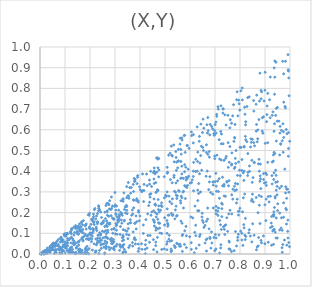
| Category | Series 0 |
|---|---|
| 0.20426082624092745 | 0.143 |
| 0.36272719815670096 | 0.294 |
| 0.8153955051735944 | 0.355 |
| 0.3729846032833899 | 0.336 |
| 0.8045086489264134 | 0.515 |
| 0.1439994279631579 | 0.007 |
| 0.8717027761930042 | 0.6 |
| 0.9951669443724769 | 0.851 |
| 0.8722146589589249 | 0.2 |
| 0.8231444333154888 | 0.639 |
| 0.8858583309482669 | 0.054 |
| 0.6836288513205269 | 0.028 |
| 0.6956370302324736 | 0.582 |
| 0.9128229049434629 | 0.277 |
| 0.7866731166661785 | 0.745 |
| 0.9286679426933921 | 0.67 |
| 0.03636047862152203 | 0.013 |
| 0.9949222020885375 | 0.055 |
| 0.10073876753924604 | 0.004 |
| 0.6173904949461092 | 0.006 |
| 0.9361999415781771 | 0.593 |
| 0.4546234243039249 | 0.209 |
| 0.7942854840604906 | 0.445 |
| 0.453441863623966 | 0.07 |
| 0.7034644494690323 | 0.39 |
| 0.08862146865692822 | 0.014 |
| 0.8657607751653718 | 0.02 |
| 0.1778056656379653 | 0.087 |
| 0.9908134551769016 | 0.11 |
| 0.5734910125883016 | 0.365 |
| 0.025885028320127956 | 0.019 |
| 0.18910464906426017 | 0.087 |
| 0.058720695203867024 | 0.018 |
| 0.9988391513887683 | 0.545 |
| 0.7531435049663163 | 0.418 |
| 0.5453642049344821 | 0.404 |
| 0.28661217034137265 | 0.119 |
| 0.6293666507666607 | 0.4 |
| 0.10953422019362935 | 0.038 |
| 0.736399254082159 | 0.336 |
| 0.6689070766604224 | 0.401 |
| 0.877908004540325 | 0.739 |
| 0.13989807700627843 | 0.005 |
| 0.8034697403553471 | 0.788 |
| 0.3613317264856879 | 0.166 |
| 0.2716113823469338 | 0.075 |
| 0.7772426047332179 | 0.413 |
| 0.230289860706544 | 0.058 |
| 0.9858885750368827 | 0.145 |
| 0.6006705914541699 | 0.343 |
| 0.8167280837820041 | 0.4 |
| 0.8890980154758239 | 0.594 |
| 0.8224665428520189 | 0.624 |
| 0.7261052932751103 | 0.58 |
| 0.9211750492984048 | 0.855 |
| 0.864371083432124 | 0.723 |
| 0.5536000208553401 | 0.506 |
| 0.766303091895723 | 0.43 |
| 0.2071403551075638 | 0.073 |
| 0.5785187022987416 | 0.33 |
| 0.5291774522851926 | 0.473 |
| 0.2635962169169568 | 0.113 |
| 0.9821509240772714 | 0.931 |
| 0.8086825867615756 | 0.802 |
| 0.8102758712557877 | 0.204 |
| 0.7366243455381281 | 0.28 |
| 0.2531722291397108 | 0.15 |
| 0.26981595716468465 | 0.149 |
| 0.5078422854178415 | 0.162 |
| 0.11728472437353166 | 0.02 |
| 0.2694240173599839 | 0.187 |
| 0.5298944465102073 | 0.186 |
| 0.2382102585453839 | 0.017 |
| 0.62244907969625 | 0.398 |
| 0.8028624765664213 | 0.11 |
| 0.9379420180453679 | 0.225 |
| 0.0810122083528747 | 0.057 |
| 0.9404600337599457 | 0.277 |
| 0.9440288562619685 | 0.077 |
| 0.18918474456399714 | 0.018 |
| 0.18152301695239692 | 0.024 |
| 0.5511701843380219 | 0.049 |
| 0.16602953981180335 | 0.072 |
| 0.7138296633233044 | 0.222 |
| 0.38416116291410807 | 0.184 |
| 0.5119570314778064 | 0.141 |
| 0.3589990521461809 | 0.321 |
| 0.02248040734097445 | 0.012 |
| 0.782787944527805 | 0.438 |
| 0.17037306247257478 | 0.141 |
| 0.32302890541042795 | 0.032 |
| 0.6132757652107951 | 0.537 |
| 0.7671430962477555 | 0.194 |
| 0.9367349539748241 | 0.899 |
| 0.328903918637116 | 0.187 |
| 0.9390570919229485 | 0.485 |
| 0.21121281889740506 | 0.104 |
| 0.6972482574754387 | 0.573 |
| 0.6987492200506394 | 0.596 |
| 0.5778197350301918 | 0.046 |
| 0.08457363760785963 | 0.071 |
| 0.0020432830335050944 | 0.002 |
| 0.739401217180128 | 0.137 |
| 0.4543857058536014 | 0.021 |
| 0.29387802545341835 | 0.059 |
| 0.16861424153614768 | 0.113 |
| 0.9874000073999551 | 0.043 |
| 0.5203910463553771 | 0.487 |
| 0.9450880229823172 | 0.704 |
| 0.09135840629216607 | 0.069 |
| 0.16371353473478523 | 0.003 |
| 0.44625596999551886 | 0.326 |
| 0.8379488037062102 | 0.399 |
| 0.36660160080648796 | 0.187 |
| 0.05054124931553772 | 0.049 |
| 0.07004184901843591 | 0.04 |
| 0.3984714322417813 | 0.325 |
| 0.05286585466638882 | 0.035 |
| 0.24626442548236527 | 0.067 |
| 0.03230455443888447 | 0.014 |
| 0.5070130685234417 | 0.047 |
| 0.7931853362486412 | 0.206 |
| 0.42846662173983563 | 0.33 |
| 0.4863749598631587 | 0.247 |
| 0.6345063372000457 | 0.292 |
| 0.6495537378866599 | 0.162 |
| 0.8796642263016647 | 0.351 |
| 0.7391998202623412 | 0.094 |
| 0.2973303675122261 | 0.035 |
| 0.10321127724795764 | 0.052 |
| 0.029147267083311723 | 0.028 |
| 0.08491017508891441 | 0.029 |
| 0.4718970721325203 | 0.307 |
| 0.34049405195712357 | 0.114 |
| 0.0896864574170767 | 0.058 |
| 0.5268406468337656 | 0.064 |
| 0.4384137567321579 | 0.25 |
| 0.6467300893166146 | 0.405 |
| 0.4402103204520892 | 0.089 |
| 0.0012947371169115263 | 0.001 |
| 0.7375912445183042 | 0.119 |
| 0.881381449106707 | 0.434 |
| 0.9009874083989451 | 0.535 |
| 0.8368346616231039 | 0.759 |
| 0.13261716964793768 | 0.052 |
| 0.6714969211813043 | 0.481 |
| 0.9345429772264244 | 0.189 |
| 0.9917687338457789 | 0.164 |
| 0.23528196132088064 | 0.003 |
| 0.04596977145695347 | 0.024 |
| 0.1025078431906482 | 0.09 |
| 0.46363222152208994 | 0.297 |
| 0.45744265631101555 | 0.153 |
| 0.47564024752365486 | 0.15 |
| 0.2875647804557574 | 0.063 |
| 0.9486080406341058 | 0.327 |
| 0.2306459618919119 | 0.077 |
| 0.08520337376985399 | 0.003 |
| 0.7167963672757596 | 0.552 |
| 0.9510649353961637 | 0.242 |
| 0.1480542360676662 | 0.1 |
| 0.4215163813903171 | 0.002 |
| 0.40119820566899056 | 0.31 |
| 0.3168165262415932 | 0.19 |
| 0.7139972592213552 | 0.302 |
| 0.6062332316873058 | 0.345 |
| 0.2650329611128587 | 0.138 |
| 0.7885413541185451 | 0.784 |
| 0.51032174629952 | 0.395 |
| 0.05764543697486646 | 0.003 |
| 0.39311373453499665 | 0.048 |
| 0.5815192118134738 | 0.268 |
| 0.1721933965001573 | 0.063 |
| 0.438152989882832 | 0.357 |
| 0.182704542981746 | 0.029 |
| 0.1565620977351455 | 0.128 |
| 0.7166259490193165 | 0.364 |
| 0.19839203905748337 | 0.196 |
| 0.4785693153477907 | 0.125 |
| 0.21443484136136948 | 0.152 |
| 0.938091676849601 | 0.629 |
| 0.04492601517536854 | 0.041 |
| 0.23865719245895756 | 0.213 |
| 0.8077638655480437 | 0.068 |
| 0.9392154291078335 | 0.854 |
| 0.13203354356826114 | 0.008 |
| 0.9680639251904615 | 0.03 |
| 0.9307343503792886 | 0.112 |
| 0.5241613252941968 | 0.011 |
| 0.680394147234449 | 0.075 |
| 0.8210393994593771 | 0.069 |
| 0.11080782466738104 | 0.054 |
| 0.3227594535843141 | 0.201 |
| 0.4868497504389193 | 0.099 |
| 0.32727324132181057 | 0.195 |
| 0.028985612871642363 | 0.013 |
| 0.16918695758305713 | 0.079 |
| 0.19706647920278675 | 0.125 |
| 0.08908796911676908 | 0.014 |
| 0.21254556123435586 | 0.172 |
| 0.12583671574990285 | 0.122 |
| 0.6788178619125795 | 0.576 |
| 0.23004643392242385 | 0.196 |
| 0.42809470955344475 | 0.029 |
| 0.8079894780572482 | 0.456 |
| 0.08929886844066193 | 0.02 |
| 0.9349350752687714 | 0.36 |
| 0.057265236243856155 | 0.05 |
| 0.9657609768777229 | 0.597 |
| 0.9729835945534653 | 0.491 |
| 0.22138345916885083 | 0.007 |
| 0.9108135810169176 | 0.538 |
| 0.7571453855427139 | 0.058 |
| 0.6559080299571 | 0.128 |
| 0.2813214126635343 | 0.071 |
| 0.16292038187066993 | 0.132 |
| 0.3694038933034278 | 0.212 |
| 0.7820069659544412 | 0.341 |
| 0.3353505026928243 | 0.046 |
| 0.37665727184385667 | 0.071 |
| 0.192959501167844 | 0.19 |
| 0.45657888795504553 | 0.4 |
| 0.3558701874518294 | 0.269 |
| 0.43123808488022775 | 0.089 |
| 0.08494730590054211 | 0.081 |
| 0.7706854030230755 | 0.667 |
| 0.42359506835227 | 0.166 |
| 0.08677458988044096 | 0.022 |
| 0.6676205136406256 | 0.624 |
| 0.5682508094975662 | 0.149 |
| 0.4699746184392396 | 0.464 |
| 0.6510035724255978 | 0.515 |
| 0.6057660741158809 | 0.59 |
| 0.936171208440344 | 0.118 |
| 0.9362556265692535 | 0.392 |
| 0.18558498391098854 | 0.072 |
| 0.12310515082170304 | 0.1 |
| 0.9394032443868113 | 0.933 |
| 0.9799674906378966 | 0.713 |
| 0.09842973614849981 | 0.096 |
| 0.2620089055709266 | 0.171 |
| 0.3751388929189067 | 0.223 |
| 0.508905180460514 | 0.218 |
| 0.18023294945812696 | 0.01 |
| 0.0499399534771201 | 0.05 |
| 0.3791380045854198 | 0.148 |
| 0.8734251827224896 | 0.436 |
| 0.5286984664390291 | 0.344 |
| 0.3082544406471913 | 0.047 |
| 0.9920679058266617 | 0.963 |
| 0.47497004385624664 | 0.232 |
| 0.3931199917037339 | 0.013 |
| 0.8668659235164714 | 0.767 |
| 0.8807666132165727 | 0.377 |
| 0.896425141647479 | 0.739 |
| 0.5113057417087165 | 0.134 |
| 0.5768870990509087 | 0.572 |
| 0.3419639466383011 | 0.198 |
| 0.5740138712299341 | 0.303 |
| 0.28448377411414394 | 0.063 |
| 0.3215787679280594 | 0.133 |
| 0.6371489536631865 | 0.545 |
| 0.32032923089676835 | 0.095 |
| 0.3405001858084 | 0.228 |
| 0.7319695607502713 | 0.702 |
| 0.5898686009530584 | 0.524 |
| 0.8832583714800242 | 0.316 |
| 0.3249566990516528 | 0.191 |
| 0.6655981573459808 | 0.158 |
| 0.9858304780624292 | 0.214 |
| 0.37993536864136357 | 0.148 |
| 0.22609160054632638 | 0.183 |
| 0.7711022381137624 | 0.265 |
| 0.6358103167709765 | 0.209 |
| 0.19824517738709824 | 0.131 |
| 0.10084685162209162 | 0.098 |
| 0.09990840605668316 | 0.032 |
| 0.6773573168856797 | 0.468 |
| 0.47472515713985886 | 0.373 |
| 0.011555716567567487 | 0.008 |
| 0.8660408566263198 | 0.626 |
| 0.9054767166310111 | 0.331 |
| 0.474117920409582 | 0.151 |
| 0.5683517901357025 | 0.55 |
| 0.32897169378199675 | 0.079 |
| 0.49724025372833813 | 0.271 |
| 0.45927880822789524 | 0.396 |
| 0.15998571553792695 | 0.109 |
| 0.7593739829180958 | 0.022 |
| 0.09708007251631345 | 0.041 |
| 0.7043491643790238 | 0.584 |
| 0.01748928820958795 | 0 |
| 0.29000004685441627 | 0.05 |
| 0.018456488234017354 | 0.004 |
| 0.20981636368183498 | 0.161 |
| 0.2710284507711629 | 0.105 |
| 0.2248992576885056 | 0.122 |
| 0.9424847011516664 | 0.67 |
| 0.3011384706428917 | 0.237 |
| 0.184593329495772 | 0.12 |
| 0.9687647168473578 | 0.547 |
| 0.023065317334067137 | 0.004 |
| 0.2521463105255711 | 0.048 |
| 0.24326686488832716 | 0.097 |
| 0.969267750650562 | 0.008 |
| 0.3945448865820159 | 0.202 |
| 0.12859558118037273 | 0.122 |
| 0.6346397889964022 | 0.34 |
| 0.01417654244990263 | 0.001 |
| 0.8168713114256172 | 0.52 |
| 0.7596252316662185 | 0.519 |
| 0.583197099466221 | 0.419 |
| 0.15420562381909142 | 0.098 |
| 0.5393932711820336 | 0.17 |
| 0.535807597800587 | 0.37 |
| 0.908453877123066 | 0.715 |
| 0.7889481639450913 | 0.265 |
| 0.7594488594356501 | 0.024 |
| 0.04619025106576036 | 0.024 |
| 0.44734471452241786 | 0.203 |
| 0.21665004354538941 | 0.155 |
| 0.46330757036101566 | 0.057 |
| 0.23510525273766514 | 0.22 |
| 0.9062308233953231 | 0.639 |
| 0.4214046086001928 | 0.045 |
| 0.6055044209759267 | 0.022 |
| 0.3036657669856002 | 0.191 |
| 0.1585959470023366 | 0.014 |
| 0.9560370313628218 | 0.642 |
| 0.7063644272372702 | 0.303 |
| 0.28397215981434165 | 0.029 |
| 0.4980253947897627 | 0.14 |
| 0.046613365895329606 | 0.033 |
| 0.02822613965028542 | 0.003 |
| 0.26868108972213234 | 0.077 |
| 0.9962703725989592 | 0.764 |
| 0.0200896544636755 | 0.007 |
| 0.8504853275505116 | 0.146 |
| 0.3465654816147046 | 0.094 |
| 0.9007436654336358 | 0.878 |
| 0.5296526280565605 | 0.266 |
| 0.2570990968569683 | 0.05 |
| 0.7551997729883904 | 0.193 |
| 0.051347332949236546 | 0.032 |
| 0.841455578038374 | 0.087 |
| 0.7802712066780634 | 0.626 |
| 0.13700470372356666 | 0.061 |
| 0.4636971860242297 | 0.115 |
| 0.2302775628659215 | 0.154 |
| 0.06256094666790346 | 0.055 |
| 0.014198430732694445 | 0.001 |
| 0.26866485867571865 | 0.204 |
| 0.9588104168219957 | 0.478 |
| 0.7272049085964322 | 0.219 |
| 0.2061544478597367 | 0.167 |
| 0.5695257522095508 | 0.012 |
| 0.4684814404825458 | 0.193 |
| 0.676253433226015 | 0.121 |
| 0.14466272177499684 | 0.03 |
| 0.5927035661395808 | 0.41 |
| 0.704407459936592 | 0.077 |
| 0.456981484186502 | 0.416 |
| 0.3159990297996561 | 0.173 |
| 0.6809002965666019 | 0.626 |
| 0.43840382563686775 | 0.337 |
| 0.22588481077879086 | 0.044 |
| 0.8459373146967529 | 0.257 |
| 0.30604041466172127 | 0.115 |
| 0.4560899790039462 | 0.266 |
| 0.07936626503724276 | 0.025 |
| 0.27755853285971044 | 0.218 |
| 0.24707490026591095 | 0.048 |
| 0.6065989490808291 | 0.572 |
| 0.711970872658111 | 0.712 |
| 0.9744610470010434 | 0.178 |
| 0.6307761761957774 | 0.209 |
| 0.19988545812393732 | 0.101 |
| 0.4646963885246441 | 0.179 |
| 0.14191714509666276 | 0.052 |
| 0.6478444516582659 | 0.179 |
| 0.15376117158035918 | 0.018 |
| 0.3335747542528341 | 0.01 |
| 0.27826512195578756 | 0.02 |
| 0.1089263109806351 | 0.016 |
| 0.29980645831950303 | 0.297 |
| 0.3325880177130224 | 0.264 |
| 0.8728499791190857 | 0.039 |
| 0.5103835539593453 | 0.148 |
| 0.10969764513665536 | 0.096 |
| 0.5844428979394815 | 0.357 |
| 0.640864908199048 | 0.094 |
| 0.0568935914425055 | 0.019 |
| 0.1553204743909501 | 0.004 |
| 0.25229424011980706 | 0.078 |
| 0.4306753909956903 | 0.194 |
| 0.4712468769461454 | 0.168 |
| 0.4436246937371704 | 0.291 |
| 0.8318467751030398 | 0.394 |
| 0.3939248193291073 | 0.209 |
| 0.3518711287475502 | 0.281 |
| 0.006466064222615753 | 0 |
| 0.48481180038158467 | 0.234 |
| 0.924830814015153 | 0.149 |
| 0.279748951341237 | 0.15 |
| 0.37431770316361745 | 0.302 |
| 0.7840422815550983 | 0.5 |
| 0.9443461906131343 | 0.38 |
| 0.8757161610599139 | 0.649 |
| 0.3470099173156461 | 0.272 |
| 0.679375428741443 | 0.374 |
| 0.5472866330707112 | 0.268 |
| 0.18481765726021337 | 0.002 |
| 0.31463823791160084 | 0.16 |
| 0.024562395591210873 | 0.016 |
| 0.8845072735510909 | 0.75 |
| 0.9937405560151178 | 0.884 |
| 0.33488732583611447 | 0.067 |
| 0.7473145273250765 | 0.175 |
| 0.05457578435853205 | 0.046 |
| 0.26365798267513185 | 0.234 |
| 0.8013608610128926 | 0.378 |
| 0.3515563889180784 | 0.074 |
| 0.5370285449091395 | 0.04 |
| 0.9597704210461385 | 0.584 |
| 0.7660287465224299 | 0.012 |
| 0.07337214603317643 | 0.07 |
| 0.20146993101728994 | 0.122 |
| 0.6657694304707963 | 0.527 |
| 0.09477180252355033 | 0.015 |
| 0.10936004980919278 | 0.065 |
| 0.8996808543108922 | 0.238 |
| 0.19243963995071178 | 0.074 |
| 0.695457769021146 | 0.08 |
| 0.09226628915792545 | 0.043 |
| 0.9035800635301651 | 0.161 |
| 0.5673697573140551 | 0.272 |
| 0.7251167387082349 | 0.454 |
| 0.7939297808261351 | 0.188 |
| 0.8228926372969217 | 0.552 |
| 0.17120805811038198 | 0.08 |
| 0.5411476880764686 | 0.033 |
| 0.6227105871434386 | 0.139 |
| 0.9066416683210102 | 0.384 |
| 0.4203303210976038 | 0.023 |
| 0.06442364142364798 | 0.019 |
| 0.039709650400051144 | 0.007 |
| 0.015095522348089085 | 0.004 |
| 0.47003341552970834 | 0.31 |
| 0.6992594932943975 | 0.016 |
| 0.06327339114669106 | 0.021 |
| 0.8489284193497505 | 0.346 |
| 0.5622545279779477 | 0.037 |
| 0.03956609611094708 | 0.033 |
| 0.08862704645607045 | 0.018 |
| 0.9877208054636859 | 0.581 |
| 0.10461721826170534 | 0.095 |
| 0.6309308755530739 | 0.309 |
| 0.8307557445307142 | 0.379 |
| 0.16261878458571755 | 0.131 |
| 0.8163658370627587 | 0.126 |
| 0.2444609856516442 | 0.146 |
| 0.5241531355454992 | 0.024 |
| 0.6522127907961502 | 0.651 |
| 0.5806394510945289 | 0.491 |
| 0.9709307784704868 | 0.046 |
| 0.3033758138181287 | 0.195 |
| 0.1879722278568593 | 0.018 |
| 0.693427982916604 | 0.222 |
| 0.1308535162450104 | 0.073 |
| 0.013555015750910893 | 0.012 |
| 0.13812422824341086 | 0.046 |
| 0.5718445090263268 | 0.299 |
| 0.4766020361574057 | 0.202 |
| 0.061018017841993344 | 0.037 |
| 0.5437429590511504 | 0.343 |
| 0.6303100749555192 | 0.447 |
| 0.932441615161987 | 0.188 |
| 0.19632354208822012 | 0.187 |
| 0.4557711734934117 | 0.362 |
| 0.8765001430850708 | 0.283 |
| 0.9220824252134225 | 0.127 |
| 0.8309268377944239 | 0.755 |
| 0.6189112443693658 | 0.105 |
| 0.8474847007029305 | 0.453 |
| 0.5197954411267353 | 0.062 |
| 0.703966373760818 | 0.194 |
| 0.8565176419515373 | 0.443 |
| 0.15540300142060415 | 0.043 |
| 0.5469065270417945 | 0.052 |
| 0.06410192118651614 | 0.051 |
| 0.1325084659663236 | 0.067 |
| 0.46140048383209087 | 0.2 |
| 0.9904694796470415 | 0.313 |
| 0.4601088098833448 | 0.387 |
| 0.31082777348556867 | 0.165 |
| 0.30522770109259345 | 0.136 |
| 0.5639885568159662 | 0.159 |
| 0.08196503792780874 | 0.033 |
| 0.7043358968642804 | 0.23 |
| 0.14392300581092432 | 0.13 |
| 0.1820501945670675 | 0.14 |
| 0.7442497529413366 | 0.623 |
| 0.2657996756755838 | 0.051 |
| 0.9748557956643837 | 0.563 |
| 0.3468507598189753 | 0.326 |
| 0.7518277660546295 | 0.67 |
| 0.3733791252779325 | 0.262 |
| 0.7596161101037795 | 0.609 |
| 0.216819633199405 | 0.142 |
| 0.8743898490281056 | 0.08 |
| 0.3475299151544078 | 0.11 |
| 0.5786745976359775 | 0.573 |
| 0.7995920887262412 | 0.221 |
| 0.5086908102517066 | 0.419 |
| 0.6377136803622551 | 0.568 |
| 0.3273101474759377 | 0.149 |
| 0.578369958767724 | 0.397 |
| 0.9978527813160033 | 0.036 |
| 0.8216189022833787 | 0.172 |
| 0.6644832022630008 | 0.375 |
| 0.11719053958002346 | 0.007 |
| 0.26371199796718403 | 0.038 |
| 0.4231575953461152 | 0.066 |
| 0.3317082478898482 | 0.09 |
| 0.7991002491088242 | 0.695 |
| 0.540340299803426 | 0.032 |
| 0.7791659855876351 | 0.306 |
| 0.37680578951271015 | 0.365 |
| 0.20970252308538895 | 0.019 |
| 0.9644936253385915 | 0.125 |
| 0.8940855577504401 | 0.388 |
| 0.2464452301443799 | 0.145 |
| 0.8800145659117736 | 0.874 |
| 0.8863882881664555 | 0.783 |
| 0.858136655588451 | 0.523 |
| 0.515561201348522 | 0.072 |
| 0.46208719475433624 | 0.235 |
| 0.11688905705376784 | 0.014 |
| 0.3325286879307279 | 0.255 |
| 0.5787859669699013 | 0.112 |
| 0.9438361841556673 | 0.926 |
| 0.8855302659861458 | 0.277 |
| 0.8230325743517664 | 0.085 |
| 0.5623941543970058 | 0.366 |
| 0.5381870438767254 | 0.303 |
| 0.16601018328046813 | 0.107 |
| 0.2861278523852011 | 0.076 |
| 0.347224759055487 | 0.211 |
| 0.9496916603126861 | 0.708 |
| 0.2338359172759905 | 0.209 |
| 0.6906283120137467 | 0.604 |
| 0.12482016883495273 | 0.113 |
| 0.6702615923053019 | 0.169 |
| 0.9215143747658617 | 0.279 |
| 0.16165853020287324 | 0.022 |
| 0.2981756702372724 | 0.23 |
| 0.5258080050787739 | 0.196 |
| 0.670639018293984 | 0.222 |
| 0.05711004528162611 | 0.042 |
| 0.6249462732934612 | 0.027 |
| 0.9277943046694374 | 0.379 |
| 0.04684155325518613 | 0.028 |
| 0.12546514899693695 | 0.081 |
| 0.27485098894532 | 0.033 |
| 0.9110434401165222 | 0.776 |
| 0.9658451906472248 | 0.175 |
| 0.5903723064027617 | 0.366 |
| 0.09780854229775937 | 0.088 |
| 0.35324338288235635 | 0.345 |
| 0.6136469464313995 | 0.577 |
| 0.8522106534557611 | 0.369 |
| 0.23178407233084763 | 0.09 |
| 0.062078195785852164 | 0.013 |
| 0.7776672172081883 | 0.327 |
| 0.9790957057770394 | 0.41 |
| 0.6199787495047786 | 0.231 |
| 0.3363776126302538 | 0.16 |
| 0.5602186744030209 | 0.048 |
| 0.21441903279053454 | 0.181 |
| 0.6928894395682054 | 0.333 |
| 0.3066063283917877 | 0.141 |
| 0.8564555479283187 | 0.091 |
| 0.14271971840745834 | 0.123 |
| 0.07936999717300341 | 0.027 |
| 0.4134288063584255 | 0.14 |
| 0.5269543590460509 | 0.477 |
| 0.9851167176779961 | 0.601 |
| 0.13513834317303774 | 0.129 |
| 0.6992384554127247 | 0.461 |
| 0.2938205515513278 | 0.028 |
| 0.18454819231425668 | 0.023 |
| 0.04720174210735861 | 0.022 |
| 0.5620601587052249 | 0.257 |
| 0.09099548313332517 | 0.065 |
| 0.037659121539717844 | 0.021 |
| 0.1492831120470246 | 0.109 |
| 0.9602808886553285 | 0.617 |
| 0.7177175734723504 | 0.269 |
| 0.4158924407639356 | 0.307 |
| 0.6500866711725475 | 0.587 |
| 0.9448635423404214 | 0.308 |
| 0.9504226911084956 | 0.21 |
| 0.7038267954854284 | 0.211 |
| 0.18510474791884546 | 0.145 |
| 0.7188072095131992 | 0.162 |
| 0.3146516776298385 | 0.212 |
| 0.8939435389429804 | 0.663 |
| 0.7982702263489648 | 0.405 |
| 0.36487128423113924 | 0.321 |
| 0.8554831600917963 | 0.69 |
| 0.6310217869644013 | 0.258 |
| 0.8129143513113731 | 0.392 |
| 0.6646567455762276 | 0.069 |
| 0.5496873901570113 | 0.281 |
| 0.33072434501039016 | 0.005 |
| 0.5022583572252253 | 0.283 |
| 0.5507244371537914 | 0.416 |
| 0.38700082561854077 | 0.267 |
| 0.5433665554512 | 0.495 |
| 0.02298145864904544 | 0.006 |
| 0.26725092929311844 | 0.245 |
| 0.519251153065478 | 0.253 |
| 0.17191394846636188 | 0.002 |
| 0.2062814544485173 | 0.06 |
| 0.45736065057137265 | 0.136 |
| 0.6913470990447471 | 0.289 |
| 0.29697379791845435 | 0.02 |
| 0.4716922648539572 | 0.123 |
| 0.04085611938758338 | 0.038 |
| 0.1412684217614134 | 0.001 |
| 0.35605839605029443 | 0.092 |
| 0.7675953212734139 | 0.488 |
| 0.2899118780897214 | 0.232 |
| 0.38533470235325473 | 0.259 |
| 0.38854652989422445 | 0.34 |
| 0.193549941703673 | 0.07 |
| 0.6553804250012125 | 0.608 |
| 0.9830871563900571 | 0.325 |
| 0.2908837190141548 | 0.1 |
| 0.6747519111918551 | 0.311 |
| 0.9930929654274524 | 0.472 |
| 0.24334659369553313 | 0.043 |
| 0.32531762476069437 | 0.164 |
| 0.25022515362666975 | 0.153 |
| 0.05069194059077575 | 0.023 |
| 0.7860606143879825 | 0.247 |
| 0.590301444214794 | 0.332 |
| 0.5443435902315228 | 0.231 |
| 0.27562230909470287 | 0.144 |
| 0.2651025748667163 | 0.035 |
| 0.7070400733357721 | 0.665 |
| 0.7612626456820932 | 0.649 |
| 0.948617607477532 | 0.642 |
| 0.06478933889483973 | 0.007 |
| 0.47880975000366033 | 0.148 |
| 0.6366966198652242 | 0.044 |
| 0.2591532778551432 | 0.005 |
| 0.2858491683251537 | 0.05 |
| 0.2299902381585225 | 0.155 |
| 0.7116976389886992 | 0.187 |
| 0.05992076750180131 | 0.043 |
| 0.525292402880356 | 0.521 |
| 0.15098594749160477 | 0.057 |
| 0.9337655798889366 | 0.479 |
| 0.7114628715629158 | 0.207 |
| 0.7799922853550748 | 0.42 |
| 0.7039282563832434 | 0.025 |
| 0.12228663674618567 | 0.019 |
| 0.748352555681723 | 0.347 |
| 0.09909400616866038 | 0.058 |
| 0.8709339760727003 | 0.557 |
| 0.4161470316814657 | 0.336 |
| 0.9339957032649763 | 0.047 |
| 0.31849406053007345 | 0.017 |
| 0.5855228764914858 | 0.088 |
| 0.259283076842725 | 0.133 |
| 0.255020926053817 | 0.16 |
| 0.008095409797783337 | 0.001 |
| 0.14721714651709628 | 0.105 |
| 0.10541268971136786 | 0.027 |
| 0.7562831567982237 | 0.354 |
| 0.23090458468818775 | 0.065 |
| 0.776617322416113 | 0.016 |
| 0.5678010840873633 | 0.367 |
| 0.181254905947143 | 0.095 |
| 0.05658065736859974 | 0.041 |
| 0.6601173593025221 | 0.138 |
| 0.3867552170539166 | 0.156 |
| 0.7293817738351213 | 0.24 |
| 0.3917910161231768 | 0.257 |
| 0.3317659338215668 | 0.267 |
| 0.037924944072270206 | 0.013 |
| 0.044050834896733115 | 0.019 |
| 0.6421538288732431 | 0.3 |
| 0.7858934993899251 | 0.31 |
| 0.12032422679843913 | 0.006 |
| 0.10698723412175615 | 0.052 |
| 0.6540063150937179 | 0.5 |
| 0.6916004150386978 | 0.348 |
| 0.3599121427332749 | 0.15 |
| 0.7076867145395146 | 0.477 |
| 0.6146367196234506 | 0.443 |
| 0.16604829993599746 | 0.151 |
| 0.12530533007313138 | 0.098 |
| 0.03474480502003052 | 0.017 |
| 0.256753955141265 | 0.108 |
| 0.2355386184195507 | 0.227 |
| 0.19531217262277867 | 0.069 |
| 0.942866180571502 | 0.346 |
| 0.24075881037229774 | 0.065 |
| 0.48211215110422445 | 0.212 |
| 0.8278460007979931 | 0.713 |
| 0.19342081177365456 | 0.093 |
| 0.3594797529872815 | 0.042 |
| 0.05363400375245586 | 0.039 |
| 0.166840982592244 | 0.156 |
| 0.7917482505570481 | 0.667 |
| 0.38476433504476115 | 0.121 |
| 0.39958089996737267 | 0.184 |
| 0.5568338861001821 | 0.303 |
| 0.14835425870190888 | 0.037 |
| 0.5673210759615321 | 0.424 |
| 0.7360823297297742 | 0.328 |
| 0.6726157603108296 | 0.596 |
| 0.2605264984875947 | 0.081 |
| 0.34693628663757314 | 0.229 |
| 0.7542512951191535 | 0.33 |
| 0.8543646204917316 | 0.741 |
| 0.22713113474502922 | 0.113 |
| 0.6048724873870204 | 0.054 |
| 0.6381056330865892 | 0.388 |
| 0.7157564511409074 | 0.092 |
| 0.30121251992586007 | 0.097 |
| 0.45705436340546846 | 0.341 |
| 0.40701940882640564 | 0.301 |
| 0.3751054637376978 | 0.259 |
| 0.09648727990975614 | 0.094 |
| 0.22330119152543704 | 0.072 |
| 0.5159328674413151 | 0.28 |
| 0.7240380875724001 | 0.716 |
| 0.055458457634915526 | 0.043 |
| 0.14184535394674758 | 0.007 |
| 0.12592332932652328 | 0.008 |
| 0.4986025978054306 | 0.175 |
| 0.7231757041714006 | 0.592 |
| 0.9750658168872932 | 0.733 |
| 0.22311456589377543 | 0.169 |
| 0.2003196545946735 | 0.075 |
| 0.11959740347155268 | 0.027 |
| 0.35300276874630576 | 0.123 |
| 0.08688985208394207 | 0.005 |
| 0.01742208691800118 | 0.015 |
| 0.796998627850437 | 0.207 |
| 0.8215458290682186 | 0.568 |
| 0.3382306112843646 | 0.163 |
| 0.7791549237599792 | 0.561 |
| 0.3816760782056161 | 0.048 |
| 0.2794021087585734 | 0.144 |
| 0.15307416109388694 | 0.134 |
| 0.692787761244323 | 0.349 |
| 0.5537498221504743 | 0.449 |
| 0.16401553593144247 | 0.009 |
| 0.25992172703883254 | 0.063 |
| 0.15795032181446889 | 0.025 |
| 0.9035550862739332 | 0.346 |
| 0.039189384219828205 | 0.031 |
| 0.6534681017485909 | 0.152 |
| 0.15413679464543295 | 0.058 |
| 0.8165260603606047 | 0.517 |
| 0.46309350935089144 | 0.345 |
| 0.8198624978827003 | 0.675 |
| 0.5634950919937117 | 0.447 |
| 0.5649037878123342 | 0.28 |
| 0.08314533630437315 | 0.077 |
| 0.040670593190558435 | 0.029 |
| 0.5171289073633141 | 0.09 |
| 0.03933818827646751 | 0.022 |
| 0.006195845513000675 | 0 |
| 0.9627068335479315 | 0.53 |
| 0.0729458620635628 | 0.046 |
| 0.5544683428336084 | 0.307 |
| 0.3034419138235779 | 0.147 |
| 0.44270889958904935 | 0.399 |
| 0.7014163981167668 | 0.094 |
| 0.2865389047183763 | 0.22 |
| 0.2652638921880315 | 0.099 |
| 0.8438047152162245 | 0.556 |
| 0.5091495057072216 | 0.059 |
| 0.8577438196987416 | 0.441 |
| 0.3145569519438065 | 0.166 |
| 0.5673426546344077 | 0.387 |
| 0.9183572698686018 | 0.745 |
| 0.7131235053805716 | 0.7 |
| 0.3725825298930544 | 0.107 |
| 0.13048592535564985 | 0.008 |
| 0.3417037318397995 | 0.01 |
| 0.46747941080346356 | 0.395 |
| 0.7813414429030502 | 0.462 |
| 0.6712665911982617 | 0.659 |
| 0.608976049690712 | 0.358 |
| 0.10981519875764112 | 0.041 |
| 0.3194931026076422 | 0.041 |
| 0.685891023949466 | 0.107 |
| 0.30330897284183567 | 0.212 |
| 0.22956240497447444 | 0.146 |
| 0.33264335824939306 | 0.117 |
| 0.5945291038240862 | 0.376 |
| 0.9817035990429425 | 0.706 |
| 0.4081630288535122 | 0.023 |
| 0.07466270712843925 | 0.038 |
| 0.8996353315904575 | 0.791 |
| 0.9363572322665835 | 0.491 |
| 0.7715851229248891 | 0.313 |
| 0.47154642437825967 | 0.458 |
| 0.39696530680552855 | 0.16 |
| 0.1958178586495506 | 0.026 |
| 0.7525398510028689 | 0.538 |
| 0.29001354386887834 | 0.174 |
| 0.9746595498883797 | 0.871 |
| 0.48792942404635664 | 0.23 |
| 0.7932364476382255 | 0.095 |
| 0.7904680781471831 | 0.066 |
| 0.06099586740649254 | 0.038 |
| 0.20711553619457712 | 0.099 |
| 0.059375700802825615 | 0.017 |
| 0.9939580175410113 | 0.587 |
| 0.12202464931298074 | 0.031 |
| 0.8976351770554881 | 0.343 |
| 0.8689129800091676 | 0.542 |
| 0.10022664816933358 | 0.05 |
| 0.45690671347169753 | 0.159 |
| 0.6990379441649479 | 0.578 |
| 0.2722465547447759 | 0.244 |
| 0.0920673591787835 | 0.034 |
| 0.07761808961551164 | 0.017 |
| 0.29410071364463397 | 0.026 |
| 0.7965423846989927 | 0.726 |
| 0.7252087303200132 | 0.533 |
| 0.8075120803886497 | 0.1 |
| 0.5675784648267159 | 0.561 |
| 0.12715336824010393 | 0.034 |
| 0.32897332338020135 | 0.04 |
| 0.974287231591044 | 0.247 |
| 0.7505896777721395 | 0.109 |
| 0.5856166297274839 | 0.031 |
| 0.7568663881186727 | 0.443 |
| 0.0198771802626313 | 0.009 |
| 0.9333281170791519 | 0.449 |
| 0.05374875510302091 | 0.053 |
| 0.2788001839121026 | 0.257 |
| 0.9589817908962035 | 0.198 |
| 0.30820007498654656 | 0.18 |
| 0.9453240266587835 | 0.546 |
| 0.4385954438497829 | 0.288 |
| 0.9354593396850867 | 0.204 |
| 0.5162194613904314 | 0.188 |
| 0.6131531330619605 | 0.375 |
| 0.2688791395101695 | 0.133 |
| 0.039035054221068455 | 0.019 |
| 0.6682051849466412 | 0.073 |
| 0.10251447408595171 | 0.038 |
| 0.10914821814589282 | 0.1 |
| 0.043693696276168814 | 0.018 |
| 0.35404667885505037 | 0.28 |
| 0.15365477672168615 | 0.132 |
| 0.7252896327308582 | 0.118 |
| 0.7325929607833073 | 0.532 |
| 0.8994180979597842 | 0.05 |
| 0.8892570649054778 | 0.658 |
| 0.6829421110080333 | 0.297 |
| 0.26869988121594335 | 0.208 |
| 0.04728878884484844 | 0.033 |
| 0.16294357341859078 | 0.117 |
| 0.9938531287288485 | 0.51 |
| 0.335691523844887 | 0.295 |
| 0.7037439623152851 | 0.637 |
| 0.01917649647994968 | 0.009 |
| 0.11224614352080775 | 0.012 |
| 0.3931068507332862 | 0.251 |
| 0.21330463883722717 | 0.112 |
| 0.12053557612888999 | 0.106 |
| 0.380859744684368 | 0.36 |
| 0.29622661305532605 | 0.12 |
| 0.13525941110716555 | 0.045 |
| 0.45269146884111167 | 0.166 |
| 0.6487959065530435 | 0.197 |
| 0.5265868813451434 | 0.015 |
| 0.718572383951487 | 0.004 |
| 0.4968005222318024 | 0.025 |
| 0.22858614982679315 | 0.051 |
| 0.9921144989358528 | 0.077 |
| 0.15281438642782696 | 0.095 |
| 0.9860754287252933 | 0.314 |
| 0.44402992290733967 | 0.187 |
| 0.042491123672097286 | 0.016 |
| 0.047673972633530015 | 0.037 |
| 0.8075590712864164 | 0.403 |
| 0.45975067860054675 | 0.239 |
| 0.864814521313903 | 0.273 |
| 0.7670185632632917 | 0.286 |
| 0.390029586172681 | 0.371 |
| 0.7428180637804267 | 0.141 |
| 0.9586768191070117 | 0.116 |
| 0.02170874937092704 | 0.006 |
| 0.20376342867315356 | 0.101 |
| 0.259548842006064 | 0.202 |
| 0.5365058829777354 | 0.38 |
| 0.5450262488551907 | 0.284 |
| 0.9351561946397214 | 0.191 |
| 0.8187856508415416 | 0.29 |
| 0.8472367174317291 | 0.059 |
| 0.9205681695499968 | 0.658 |
| 0.37815303083438734 | 0.078 |
| 0.8498250758438631 | 0.289 |
| 0.7451534139439268 | 0.472 |
| 0.7418142452945412 | 0.279 |
| 0.17268791818711537 | 0.102 |
| 0.2393008451355152 | 0.076 |
| 0.5081038259727598 | 0.1 |
| 0.7741805730481374 | 0.721 |
| 0.45385747094975915 | 0.393 |
| 0.06843686809089233 | 0.062 |
| 0.5577261831594644 | 0.038 |
| 0.8550529108441942 | 0.538 |
| 0.880270642785818 | 0.147 |
| 0.17364944516129588 | 0.161 |
| 0.46623215484645253 | 0.464 |
| 0.6436236839308027 | 0.627 |
| 0.8843609959675504 | 0.79 |
| 0.6876075068165934 | 0.053 |
| 0.0856787993237752 | 0.065 |
| 0.9926978621433006 | 0.89 |
| 0.7600346339531308 | 0.211 |
| 0.5413726444281269 | 0.213 |
| 0.6869946651453959 | 0.616 |
| 0.5839708869417343 | 0.133 |
| 0.9491969618885189 | 0.077 |
| 0.9823173505578233 | 0.295 |
| 0.7049259552608288 | 0.328 |
| 0.5076698613418313 | 0.021 |
| 0.43796495051383066 | 0.057 |
| 0.7557325304278415 | 0.025 |
| 0.9628675005800109 | 0.532 |
| 0.011848415511778732 | 0.009 |
| 0.15776577370870948 | 0.145 |
| 0.20996512793843025 | 0.123 |
| 0.611417981933999 | 0.174 |
| 0.015212713204487693 | 0.012 |
| 0.3310959069982964 | 0.034 |
| 0.9130647515160085 | 0.057 |
| 0.3455695078255341 | 0.235 |
| 0.7469202641312628 | 0.35 |
| 0.8532726432836714 | 0.252 |
| 0.1356962884325732 | 0.091 |
| 0.5369256326031128 | 0.445 |
| 0.26719206009920726 | 0.057 |
| 0.9717272923253788 | 0.629 |
| 0.14634968861421427 | 0.029 |
| 0.3953962698938861 | 0.026 |
| 0.6454782299924035 | 0.521 |
| 0.2140081355543505 | 0.193 |
| 0.5322385279168047 | 0.189 |
| 0.6229265306909817 | 0.458 |
| 0.3370092223843676 | 0.023 |
| 0.8113916950777742 | 0.041 |
| 0.4102214476744719 | 0.387 |
| 0.7227641330417055 | 0.029 |
| 0.15697740414225825 | 0.118 |
| 0.24538207721399086 | 0.028 |
| 0.9425393943359438 | 0.405 |
| 0.5505924428583081 | 0.354 |
| 0.5126056954563023 | 0.187 |
| 0.5632904098950838 | 0.505 |
| 0.006483134900326926 | 0.001 |
| 0.342793755572241 | 0.009 |
| 0.8092613801690617 | 0.744 |
| 0.3630449972789558 | 0.151 |
| 0.5465021815344774 | 0.444 |
| 0.7304257116909367 | 0.329 |
| 0.22502971034352182 | 0.13 |
| 0.10358380865360861 | 0.086 |
| 0.47582720673329715 | 0.406 |
| 0.47279095934834126 | 0.263 |
| 0.3713210799702287 | 0.193 |
| 0.42627702028920045 | 0.386 |
| 0.6232114209845925 | 0.089 |
| 0.07289151329398413 | 0.023 |
| 0.18155735036923082 | 0.136 |
| 0.9320537064990935 | 0.687 |
| 0.31719912463917144 | 0.182 |
| 0.3379070116112982 | 0.215 |
| 0.22419318423250068 | 0.015 |
| 0.7757158155591104 | 0.544 |
| 0.23851567715599675 | 0.103 |
| 0.24251796066863196 | 0.091 |
| 0.5418239331622157 | 0.299 |
| 0.7008422646866593 | 0.349 |
| 0.8372634883013873 | 0.117 |
| 0.9660144202173011 | 0.327 |
| 0.8274193242327298 | 0.543 |
| 0.8150090105288831 | 0.142 |
| 0.9483384324022059 | 0.286 |
| 0.2373589623977903 | 0.093 |
| 0.3910454243578235 | 0.379 |
| 0.6661190577396905 | 0.014 |
| 0.024080773841760328 | 0.002 |
| 0.9368000938604654 | 0.118 |
| 0.9077825531262785 | 0.673 |
| 0.6986512096534316 | 0.473 |
| 0.7668607742618457 | 0.435 |
| 0.5649067293103451 | 0.482 |
| 0.046436145997990286 | 0.028 |
| 0.61418913281436 | 0.305 |
| 0.9110955171374093 | 0.443 |
| 0.29670436222953367 | 0.169 |
| 0.3794901729042053 | 0.351 |
| 0.8478400692722668 | 0.265 |
| 0.508382485741182 | 0.3 |
| 0.7299443792877299 | 0.371 |
| 0.12308337340885378 | 0.013 |
| 0.2713838251801892 | 0.114 |
| 0.07871300054303021 | 0.004 |
| 0.676859921175896 | 0.495 |
| 0.9777100862191046 | 0.067 |
| 0.5631088266819324 | 0.246 |
| 0.7862072494161311 | 0.039 |
| 0.1902098739724558 | 0.005 |
| 0.70663967560078 | 0.675 |
| 0.8942958872711132 | 0.36 |
| 0.7219186561289953 | 0.141 |
| 0.9450674208998872 | 0.174 |
| 0.20265480731071528 | 0.093 |
| 0.5269181296074206 | 0.243 |
| 0.5444866087681228 | 0.466 |
| 0.4969923534673366 | 0.374 |
| 0.9268271554605034 | 0.181 |
| 0.7559383037385944 | 0.062 |
| 0.41449520945125884 | 0.253 |
| 0.8314141249737078 | 0.485 |
| 0.18255204734465147 | 0.021 |
| 0.9866547520909121 | 0.269 |
| 0.31153786206205314 | 0.159 |
| 0.25603923926259275 | 0.032 |
| 0.669736351157786 | 0.584 |
| 0.631090176857284 | 0.492 |
| 0.9286157922208467 | 0.338 |
| 0.8377241437332626 | 0.425 |
| 0.26436259137731666 | 0.026 |
| 0.460578921584495 | 0.241 |
| 0.1943343343924766 | 0.001 |
| 0.7820555948335848 | 0.108 |
| 0.1504747425955425 | 0.126 |
| 0.8183125460238614 | 0.709 |
| 0.2428981306189647 | 0.202 |
| 0.4404006667330267 | 0.275 |
| 0.2588095515351927 | 0.001 |
| 0.2759242634819452 | 0.238 |
| 0.6795238111460015 | 0.081 |
| 0.3696852708210766 | 0.055 |
| 0.9708214914268817 | 0.931 |
| 0.21733314662328151 | 0.214 |
| 0.7426070782984168 | 0.462 |
| 0.3240333058515358 | 0.257 |
| 0.17057390195398714 | 0.119 |
| 0.9738897791119435 | 0.591 |
| 0.3551551724894737 | 0.032 |
| 0.08286584951784282 | 0.077 |
| 0.5532185538043918 | 0.449 |
| 0.8001136681153136 | 0.516 |
| 0.7908706544140315 | 0.08 |
| 0.9383041791651086 | 0.772 |
| 0.7185850144950201 | 0.459 |
| 0.0638512098562769 | 0.018 |
| 0.94077310832814 | 0.271 |
| 0.4798920084275268 | 0.101 |
| 0.3295189426722991 | 0.064 |
| 0.24978610760681486 | 0.11 |
| 0.5217875482603807 | 0.359 |
| 0.34863549555474127 | 0.195 |
| 0.15731580050456417 | 0.064 |
| 0.6287462353549139 | 0.614 |
| 0.9262396691584048 | 0.042 |
| 0.2137716883816403 | 0.12 |
| 0.12419611882289416 | 0.053 |
| 0.8353485505547785 | 0.102 |
| 0.6134457748069816 | 0.401 |
| 0.022840291177655847 | 0.011 |
| 0.5461582935878321 | 0.183 |
| 0.6038264179880382 | 0.179 |
| 0.7944176934169227 | 0.743 |
| 0.28427995137927153 | 0.185 |
| 0.9162180046593614 | 0.251 |
| 0.46597047819850523 | 0.301 |
| 0.17930088199733318 | 0.003 |
| 0.5604910318554789 | 0.56 |
| 0.30601110413704236 | 0.232 |
| 0.23418223082097922 | 0.233 |
| 0.28372558775226264 | 0.215 |
| 0.03274760046278302 | 0.012 |
| 0.5060406167203932 | 0.279 |
| 0.17236533721344738 | 0.067 |
| 0.007896296106705059 | 0.002 |
| 0.710300915684711 | 0.353 |
| 0.46810377689187976 | 0.01 |
| 0.9497906415175202 | 0.349 |
| 0.6656331266892752 | 0.491 |
| 0.9287956042375799 | 0.133 |
| 0.7329347783772512 | 0.7 |
| 0.24609444095397792 | 0.176 |
| 0.6396787771619865 | 0.439 |
| 0.5964372930405005 | 0.511 |
| 0.8774284041435649 | 0.4 |
| 0.3776920612596122 | 0.351 |
| 0.9026992346926302 | 0.391 |
| 0.7265830229415802 | 0.245 |
| 0.7900795070391335 | 0.38 |
| 0.14254279929087865 | 0.137 |
| 0.11024129556461526 | 0.075 |
| 0.5689220844929591 | 0.089 |
| 0.4630080859833565 | 0.04 |
| 0.11647887237353449 | 0.013 |
| 0.35229464808699273 | 0.146 |
| 0.9583591565816711 | 0.318 |
| 0.819579862772823 | 0.09 |
| 0.30499233958672756 | 0.038 |
| 0.8422956338120565 | 0.517 |
| 0.27490114639379704 | 0.182 |
| 0.995462897629804 | 0.298 |
| 0.26410108322110537 | 0.084 |
| 0.5707673199606749 | 0.094 |
| 0.7005975769770522 | 0.625 |
| 0.7395085846073882 | 0.672 |
| 0.8687477601201749 | 0.034 |
| 0.14545632951933085 | 0.002 |
| 0.019311654304791648 | 0.017 |
| 0.660314632461451 | 0.053 |
| 0.5484904504730611 | 0.186 |
| 0.22232684777973544 | 0.012 |
| 0.37127104718452575 | 0.038 |
| 0.11678480961344118 | 0.069 |
| 0.00988710056100306 | 0.008 |
| 0.8841895092995523 | 0.066 |
| 0.587225504760374 | 0.321 |
| 0.28567646625720855 | 0.275 |
| 0.13032360738184134 | 0.022 |
| 0.4133758795357746 | 0.099 |
| 0.6776713893268275 | 0.348 |
| 0.2946970187493283 | 0.059 |
| 0.48685351489083684 | 0.022 |
| 0.8916584009392841 | 0.584 |
| 0.9830372320162989 | 0.22 |
| 0.8775547197146566 | 0.236 |
| 0.23922793986637492 | 0.057 |
| 0.5881760599839729 | 0.524 |
| 0.6426100257218246 | 0.475 |
| 0.29415486653048817 | 0.168 |
| 0.8937464758371094 | 0.087 |
| 0.876009618283688 | 0.457 |
| 0.1607131061142848 | 0.012 |
| 0.8648352869021563 | 0.593 |
| 0.5601932275796546 | 0.531 |
| 0.20941375076716207 | 0.086 |
| 0.4097621150833657 | 0.305 |
| 0.5990258445065733 | 0.083 |
| 0.5785935901736179 | 0.432 |
| 0.02699159398238249 | 0.008 |
| 0.7783664683369309 | 0.563 |
| 0.16896500320719188 | 0.017 |
| 0.9410688089323501 | 0.106 |
| 0.790819068410772 | 0.338 |
| 0.5847427031897833 | 0.37 |
| 0.5093667582489958 | 0.39 |
| 0.9287756119347804 | 0.444 |
| 0.38227757060754763 | 0.069 |
| 0.7315038008178011 | 0.681 |
| 0.47360929305729493 | 0.215 |
| 0.47484297594368075 | 0.461 |
| 0.31176741406624253 | 0.153 |
| 0.7235823814771419 | 0.045 |
| 0.31959978079306206 | 0.045 |
| 0.3079135511142047 | 0.095 |
| 0.4061517566693399 | 0.049 |
| 0.9046528643403724 | 0.265 |
| 0.3333141563449873 | 0.082 |
| 0.13805657238532 | 0.104 |
| 0.514732980996352 | 0.477 |
| 0.010910821344936927 | 0.008 |
| 0.2198587290946571 | 0.22 |
| 0.18805822961788288 | 0.037 |
| 0.8498616248147369 | 0.554 |
| 0.7274085411686889 | 0.18 |
| 0.5351330957858945 | 0.527 |
| 0.7334427048388177 | 0.131 |
| 0.5740363942522588 | 0.222 |
| 0.8135832072077795 | 0.271 |
| 0.7661936647814801 | 0.632 |
| 0.8451704099154936 | 0.539 |
| 0.9690770959578142 | 0.114 |
| 0.4696364269040526 | 0.08 |
| 0.47197175799731117 | 0.416 |
| 0.5824020633881322 | 0.326 |
| 0.10652190222757618 | 0.098 |
| 0.6380722567631962 | 0.085 |
| 0.29361361643368344 | 0.07 |
| 0.7361210142075656 | 0.452 |
| 0.9354929212803923 | 0.182 |
| 0.11948548337413256 | 0.075 |
| 0.266997476276856 | 0.16 |
| 0.21665271810789188 | 0.049 |
| 0.46388496743332697 | 0.127 |
| 0.43480227900720037 | 0.234 |
| 0.29673195872837776 | 0.124 |
| 0.8820508994709226 | 0.363 |